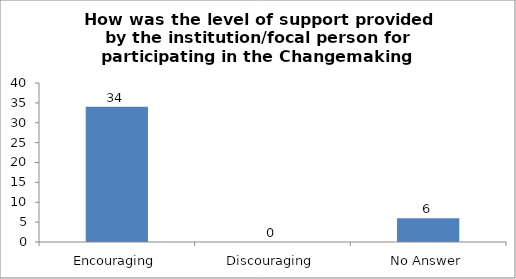
| Category | How was the level of support provided by the institution/focal person for participating in the Changemaking Intelligence Test? |
|---|---|
| Encouraging | 34 |
| Discouraging | 0 |
| No Answer | 6 |